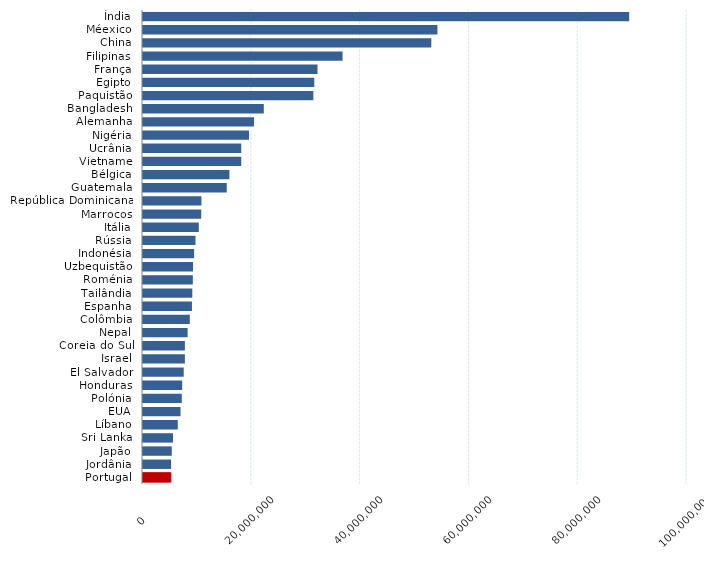
| Category | Series 0 |
|---|---|
| Índia | 89375152.218 |
| Méexico | 54130111.445 |
| China | 53000000 |
| Filipinas | 36685313.168 |
| França | 32077312.215 |
| Egipto | 31487000 |
| Paquistão | 31312000 |
| Bangladesh | 22202917.784 |
| Alemanha | 20411777.594 |
| Nigéria | 19483402.059 |
| Ucrânia | 18060000 |
| Vietname | 18060000 |
| Bélgica | 15883123.729 |
| Guatemala | 15395390.25 |
| República Dominicana | 10742800 |
| Marrocos | 10704830.038 |
| Itália | 10258423.411 |
| Rússia | 9646920 |
| Indonésia | 9402427.089 |
| Uzbequistão | 9197526.465 |
| Roménia | 9159745.933 |
| Tailândia | 9065391.618 |
| Espanha | 9000000 |
| Colômbia | 8608268.971 |
| Nepal | 8203258.737 |
| Coreia do Sul | 7704200 |
| Israel | 7701000 |
| El Salvador | 7488469.373 |
| Honduras | 7203426.673 |
| Polónia | 7131000 |
| EUA | 6899000 |
| Líbano | 6393530 |
| Sri Lanka | 5522000 |
| Japão | 5290974.223 |
| Jordânia | 5162253.521 |
| Portugal | 5127640.513 |